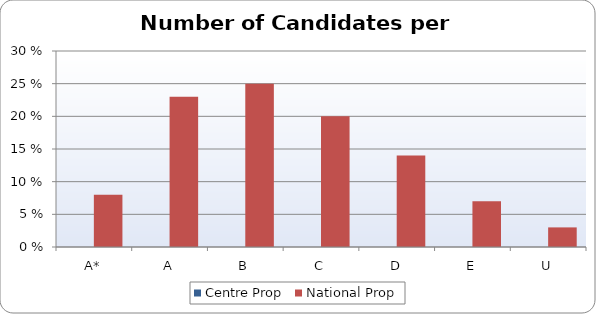
| Category | Centre Prop | National Prop |
|---|---|---|
| A* | 0 | 8 |
| A | 0 | 23 |
| B | 0 | 25 |
| C | 0 | 20 |
| D | 0 | 14 |
| E | 0 | 7 |
| U | 0 | 3 |